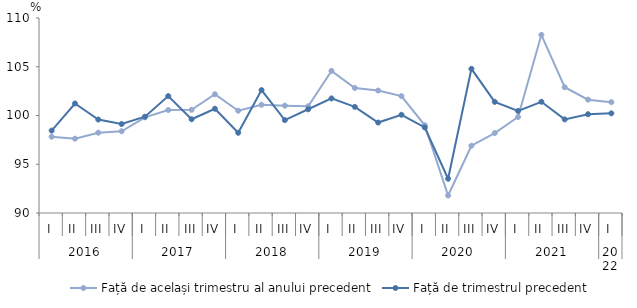
| Category | Față de același trimestru al anului precedent | Față de trimestrul precedent |
|---|---|---|
| 0 | 97.825 | 98.452 |
| 1 | 97.621 | 101.233 |
| 2 | 98.239 | 99.588 |
| 3 | 98.385 | 99.123 |
| 4 | 99.811 | 99.879 |
| 5 | 100.556 | 101.989 |
| 6 | 100.586 | 99.618 |
| 7 | 102.179 | 100.693 |
| 8 | 100.491 | 98.228 |
| 9 | 101.097 | 102.604 |
| 10 | 101.008 | 99.53 |
| 11 | 100.954 | 100.639 |
| 12 | 104.574 | 101.751 |
| 13 | 102.823 | 100.886 |
| 14 | 102.56 | 99.275 |
| 15 | 101.986 | 100.076 |
| 16 | 99 | 98.772 |
| 17 | 91.8 | 93.516 |
| 18 | 96.9 | 104.788 |
| 19 | 98.2 | 101.4 |
| 20 | 99.847 | 100.472 |
| 21 | 108.274 | 101.409 |
| 22 | 102.9 | 99.6 |
| 23 | 101.623 | 100.13 |
| 24 | 101.369 | 100.22 |